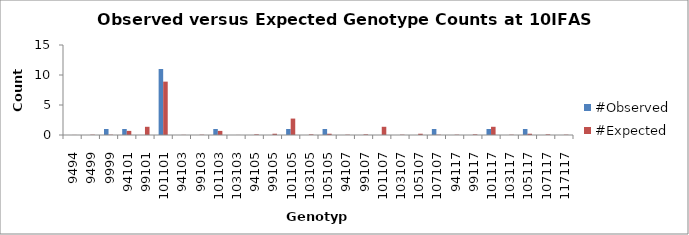
| Category | #Observed | #Expected |
|---|---|---|
| 9494.0 | 0 | 0.013 |
| 9499.0 | 0 | 0.053 |
| 9999.0 | 1 | 0.053 |
| 94101.0 | 1 | 0.684 |
| 99101.0 | 0 | 1.368 |
| 101101.0 | 11 | 8.895 |
| 94103.0 | 0 | 0.026 |
| 99103.0 | 0 | 0.053 |
| 101103.0 | 1 | 0.684 |
| 103103.0 | 0 | 0.013 |
| 94105.0 | 0 | 0.105 |
| 99105.0 | 0 | 0.211 |
| 101105.0 | 1 | 2.737 |
| 103105.0 | 0 | 0.105 |
| 105105.0 | 1 | 0.211 |
| 94107.0 | 0 | 0.053 |
| 99107.0 | 0 | 0.105 |
| 101107.0 | 0 | 1.368 |
| 103107.0 | 0 | 0.053 |
| 105107.0 | 0 | 0.211 |
| 107107.0 | 1 | 0.053 |
| 94117.0 | 0 | 0.053 |
| 99117.0 | 0 | 0.105 |
| 101117.0 | 1 | 1.368 |
| 103117.0 | 0 | 0.053 |
| 105117.0 | 1 | 0.211 |
| 107117.0 | 0 | 0.105 |
| 117117.0 | 0 | 0.053 |